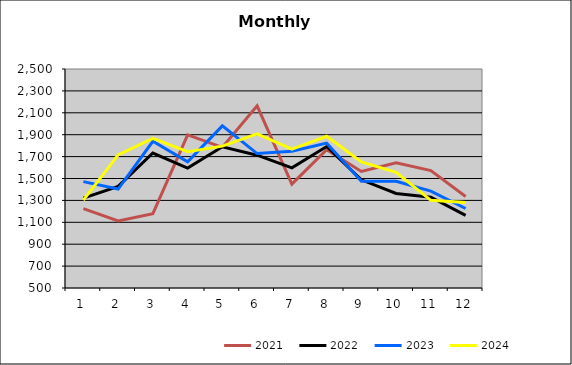
| Category | 2021 | 2022 | 2023 | 2024 |
|---|---|---|---|---|
| 0 | 1224.945 | 1320.378 | 1471.48 | 1303.286 |
| 1 | 1112.955 | 1427.347 | 1403.484 | 1715.816 |
| 2 | 1179.01 | 1732.641 | 1839.49 | 1866.838 |
| 3 | 1897.827 | 1594.906 | 1651.527 | 1745.314 |
| 4 | 1784.624 | 1789.593 | 1980.747 | 1795.398 |
| 5 | 2163.63 | 1712.772 | 1727.791 | 1908.592 |
| 6 | 1448.352 | 1597.715 | 1748.676 | 1768.606 |
| 7 | 1763.243 | 1792.018 | 1822.869 | 1886.119 |
| 8 | 1564.861 | 1487.937 | 1475.586 | 1651.076 |
| 9 | 1643.384 | 1362.939 | 1474.88 | 1556.982 |
| 10 | 1572.259 | 1328.637 | 1384.923 | 1300.586 |
| 11 | 1336.135 | 1163.728 | 1226.284 | 1280.819 |